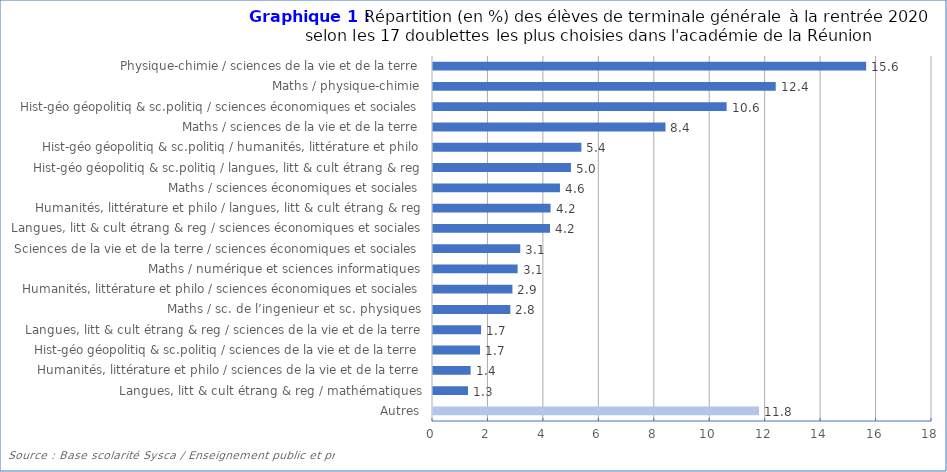
| Category | Series 1 |
|---|---|
| Autres | 11.76 |
| Langues, litt & cult étrang & reg / mathématiques | 1.263 |
| Humanités, littérature et philo / sciences de la vie et de la terre | 1.357 |
| Hist-géo géopolitiq & sc.politiq / sciences de la vie et de la terre | 1.696 |
| Langues, litt & cult étrang & reg / sciences de la vie et de la terre | 1.734 |
| Maths / sc. de l’ingenieur et sc. physiques | 2.789 |
| Humanités, littérature et philo / sciences économiques et sociales | 2.865 |
| Maths / numérique et sciences informatiques | 3.053 |
| Sciences de la vie et de la terre / sciences économiques et sociales | 3.147 |
| Langues, litt & cult étrang & reg / sciences économiques et sociales | 4.222 |
| Humanités, littérature et philo / langues, litt & cult étrang & reg | 4.24 |
| Maths / sciences économiques et sociales | 4.58 |
| Hist-géo géopolitiq & sc.politiq / langues, litt & cult étrang & reg | 4.975 |
| Hist-géo géopolitiq & sc.politiq / humanités, littérature et philo | 5.352 |
| Maths / sciences de la vie et de la terre | 8.387 |
| Hist-géo géopolitiq & sc.politiq / sciences économiques et sociales | 10.592 |
| Maths / physique-chimie | 12.363 |
| Physique-chimie / sciences de la vie et de la terre | 15.624 |